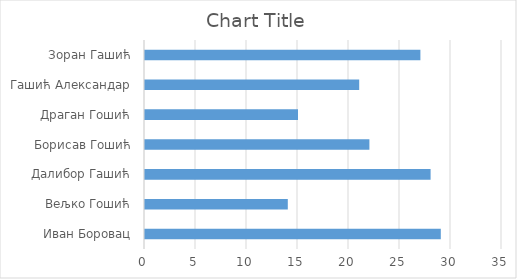
| Category | Series 0 |
|---|---|
| Иван Боровац | 29 |
| Вељко Гошић | 14 |
| Далибор Гашић | 28 |
| Борисав Гошић | 22 |
| Драган Гошић | 15 |
| Гашић Александар | 21 |
| Зоран Гашић | 27 |